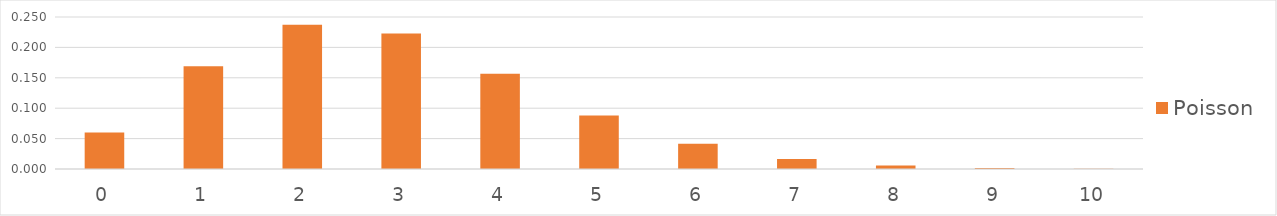
| Category | Poisson |
|---|---|
| 0.0 | 0.06 |
| 1.0 | 0.169 |
| 2.0 | 0.237 |
| 3.0 | 0.223 |
| 4.0 | 0.157 |
| 5.0 | 0.088 |
| 6.0 | 0.041 |
| 7.0 | 0.017 |
| 8.0 | 0.006 |
| 9.0 | 0.002 |
| 10.0 | 0.001 |